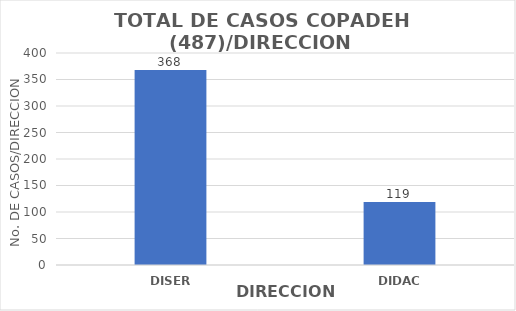
| Category | Series 0 |
|---|---|
| DISER | 368 |
| DIDAC | 119 |